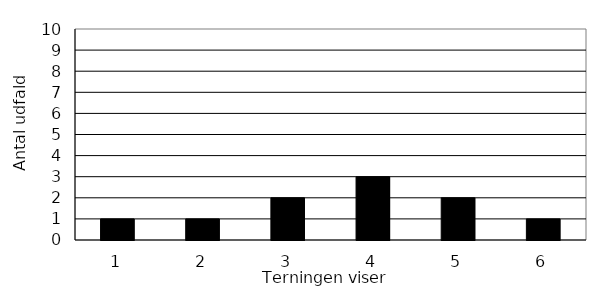
| Category | Series 0 |
|---|---|
| 0 | 1 |
| 1 | 1 |
| 2 | 2 |
| 3 | 3 |
| 4 | 2 |
| 5 | 1 |